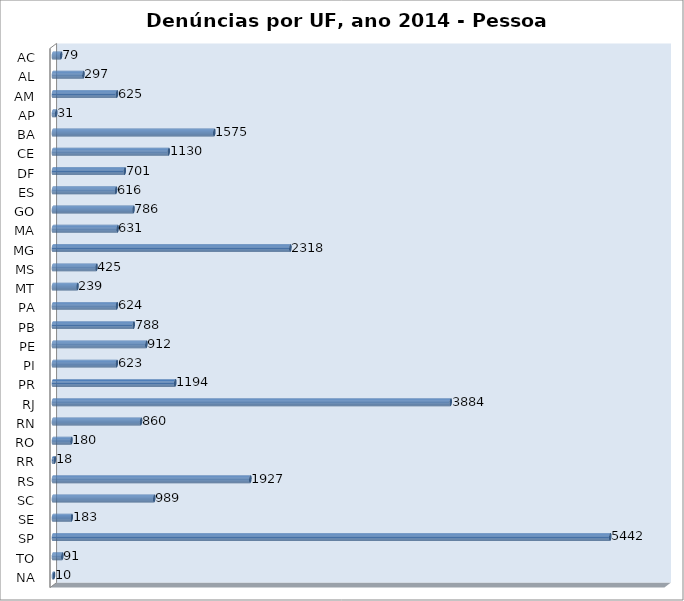
| Category | Series 0 |
|---|---|
| AC | 79 |
| AL | 297 |
| AM | 625 |
| AP | 31 |
| BA | 1575 |
| CE | 1130 |
| DF | 701 |
| ES | 616 |
| GO | 786 |
| MA | 631 |
| MG | 2318 |
| MS | 425 |
| MT | 239 |
| PA | 624 |
| PB | 788 |
| PE | 912 |
| PI | 623 |
| PR | 1194 |
| RJ | 3884 |
| RN | 860 |
| RO | 180 |
| RR | 18 |
| RS | 1927 |
| SC | 989 |
| SE | 183 |
| SP | 5442 |
| TO | 91 |
| NA | 10 |